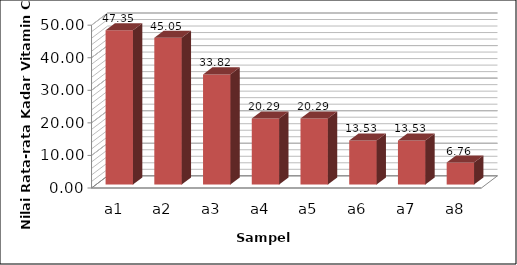
| Category | Series 0 |
|---|---|
| a1 | 47.349 |
| a2 | 45.051 |
| a3 | 33.821 |
| a4 | 20.293 |
| a5 | 20.293 |
| a6 | 13.528 |
| a7 | 13.528 |
| a8 | 6.764 |